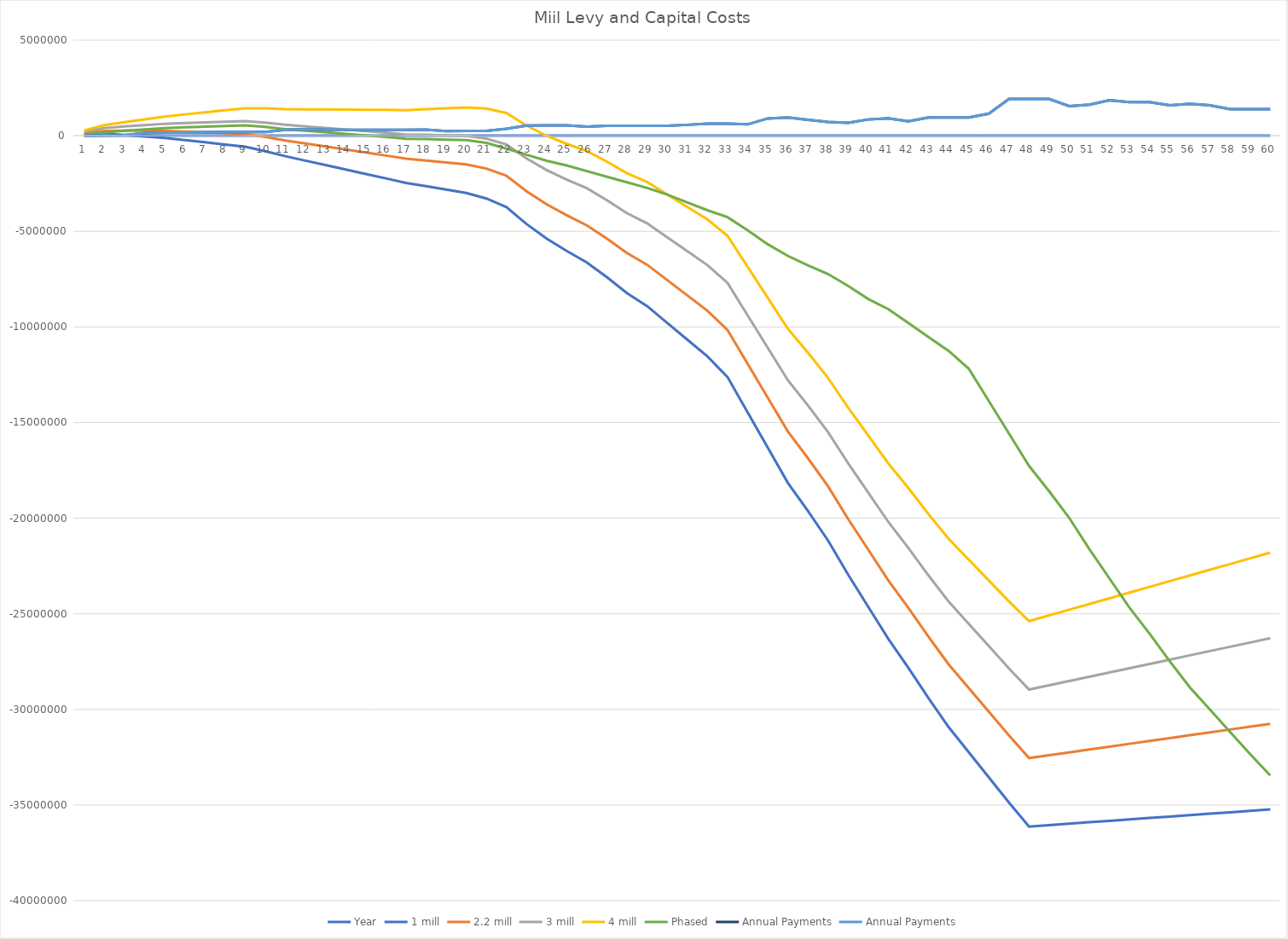
| Category | Year | 1 mill | 2.2 mill | 3 mill | 4 mill | Phased | Annual Payments |
|---|---|---|---|---|---|---|---|
| 0 | 1 | 54603.242 | 129206.484 | 203809.726 | 278412.968 | 54603.242 | 0 |
| 1 | 2 | 102446.484 | 251652.968 | 400859.452 | 550065.936 | 177049.726 | 20000 |
| 2 | 3 | 39904.726 | 263714.452 | 487524.178 | 711333.904 | 263714.452 | 26760 |
| 3 | 4 | -41224.032 | 257188.936 | 555601.904 | 854014.872 | 331792.178 | 137145 |
| 4 | 5 | -122352.79 | 250663.42 | 623679.63 | 996695.84 | 399869.904 | 155732 |
| 5 | 6 | -228481.548 | 219137.904 | 666757.356 | 1114376.808 | 442947.63 | 155732 |
| 6 | 7 | -345471.306 | 176751.388 | 698974.082 | 1221196.776 | 475164.356 | 180732 |
| 7 | 8 | -462461.064 | 134364.872 | 731190.808 | 1328016.744 | 507381.082 | 191593 |
| 8 | 9 | -579450.822 | 91978.356 | 763407.534 | 1434836.712 | 539597.808 | 191593 |
| 9 | 10 | -811096.58 | -65064.16 | 680968.26 | 1427000.68 | 457158.534 | 191593 |
| 10 | 11 | -1072742.338 | -252106.676 | 568528.986 | 1389164.648 | 344719.26 | 306249 |
| 11 | 12 | -1304388.096 | -409149.192 | 486089.712 | 1381328.616 | 262279.986 | 336249 |
| 12 | 13 | -1536033.854 | -566191.708 | 403650.438 | 1373492.584 | 179840.712 | 306249 |
| 13 | 14 | -1767679.612 | -723234.224 | 321211.164 | 1365656.552 | 97401.438 | 306249 |
| 14 | 15 | -1999325.37 | -880276.74 | 238771.89 | 1357820.52 | 14962.164 | 306249 |
| 15 | 16 | -2230971.128 | -1037319.256 | 156332.616 | 1349984.488 | -67477.11 | 306249 |
| 16 | 17 | -2470856.886 | -1202601.772 | 65653.342 | 1333908.456 | -158156.384 | 306249 |
| 17 | 18 | -2640739.644 | -1297881.288 | 44977.068 | 1387835.424 | -178832.658 | 314489 |
| 18 | 19 | -2817668.402 | -1400206.804 | 17254.794 | 1434716.392 | -206554.932 | 244486 |
| 19 | 20 | -2994597.16 | -1502532.32 | -10467.48 | 1481597.36 | -234277.206 | 251532 |
| 20 | 21 | -3282527.918 | -1715859.836 | -149191.754 | 1417476.328 | -373001.48 | 251532 |
| 21 | 22 | -3736458.676 | -2095187.352 | -453916.028 | 1187355.296 | -677725.754 | 362534 |
| 22 | 23 | -4619252.434 | -2903377.868 | -1187503.302 | 528371.264 | -993557.028 | 528534 |
| 23 | 24 | -5376044.192 | -3585566.384 | -1795088.576 | -4610.768 | -1309388.302 | 539641 |
| 24 | 25 | -6024478.95 | -4159397.9 | -2294316.85 | -429235.8 | -1555563.576 | 539641 |
| 25 | 26 | -6625945.708 | -4686261.416 | -2746577.124 | -806892.832 | -1849731.85 | 469985 |
| 26 | 27 | -7398287.466 | -5383999.932 | -3369712.398 | -1355424.864 | -2143900.124 | 517978 |
| 27 | 28 | -8230629.224 | -6141738.448 | -4052847.672 | -1963956.896 | -2438068.398 | 517978 |
| 28 | 29 | -8909977.982 | -6746483.964 | -4582989.946 | -2419495.928 | -2732236.672 | 517978 |
| 29 | 30 | -9787136.74 | -7549039.48 | -5310942.22 | -3072844.96 | -3076404.946 | 517978 |
| 30 | 31 | -10664295.498 | -8351594.996 | -6038894.494 | -3726193.992 | -3486228.22 | 567978 |
| 31 | 32 | -11541454.256 | -9154150.512 | -6766846.768 | -4379543.024 | -3896051.494 | 633633 |
| 32 | 33 | -12621007.014 | -10159100.028 | -7697193.042 | -5235286.056 | -4263273.768 | 633633 |
| 33 | 34 | -14464485.772 | -11927975.544 | -9391465.316 | -6854955.088 | -4941861.042 | 591032 |
| 34 | 35 | -16307964.53 | -13696851.06 | -11085737.59 | -8474624.12 | -5675448.316 | 902397 |
| 35 | 36 | -18151443.288 | -15465726.576 | -12780009.864 | -10094293.152 | -6283033.59 | 957397 |
| 36 | 37 | -19625143.046 | -16864823.092 | -14104503.138 | -11344183.184 | -6782261.864 | 831395 |
| 37 | 38 | -21168842.804 | -18333919.608 | -15498996.412 | -12664073.216 | -7234522.138 | 723038 |
| 38 | 39 | -22949410.562 | -20039884.124 | -17130357.686 | -14220831.248 | -7857657.412 | 676070 |
| 39 | 40 | -24632335.32 | -21648205.64 | -18664075.96 | -15679946.28 | -8540792.686 | 846945 |
| 40 | 41 | -26315260.078 | -23256527.156 | -20197794.234 | -17139061.312 | -9070934.96 | 906945 |
| 41 | 42 | -27827309.836 | -24693973.672 | -21560637.508 | -18427301.344 | -9798887.234 | 753952 |
| 42 | 43 | -29414359.594 | -26206420.188 | -22998480.782 | -19790541.376 | -10526839.508 | 951762 |
| 43 | 44 | -30926409.352 | -27643866.704 | -24361324.056 | -21078781.408 | -11254791.782 | 951762 |
| 44 | 45 | -32240649.11 | -28883503.22 | -25526357.33 | -22169211.44 | -12185138.056 | 951762 |
| 45 | 46 | -33554888.868 | -30123139.736 | -26691390.604 | -23259641.472 | -13879410.33 | 1154156 |
| 46 | 47 | -34869128.626 | -31362776.252 | -27856423.878 | -24350071.504 | -15573682.604 | 1918082 |
| 47 | 48 | -36125974.384 | -32545018.768 | -28964063.152 | -25383107.536 | -17267954.878 | 1918082 |
| 48 | 49 | -36051371.142 | -32395812.284 | -28740253.426 | -25084694.568 | -18592448.152 | 1918082 |
| 49 | 50 | -35976767.9 | -32246605.8 | -28516443.7 | -24786281.6 | -19986941.426 | 1548303 |
| 50 | 51 | -35902164.658 | -32097399.316 | -28292633.974 | -24487868.632 | -21618302.7 | 1618303 |
| 51 | 52 | -35827561.416 | -31948192.832 | -28068824.248 | -24189455.664 | -23152020.974 | 1855171 |
| 52 | 53 | -35752958.174 | -31798986.348 | -27845014.522 | -23891042.696 | -24685739.248 | 1757528 |
| 53 | 54 | -35678354.932 | -31649779.864 | -27621204.796 | -23592629.728 | -26048582.522 | 1757528 |
| 54 | 55 | -35603751.69 | -31500573.38 | -27397395.07 | -23294216.76 | -27486425.796 | 1586653 |
| 55 | 56 | -35529148.448 | -31351366.896 | -27173585.344 | -22995803.792 | -28849269.07 | 1661653 |
| 56 | 57 | -35454545.206 | -31202160.412 | -26949775.618 | -22697390.824 | -30014302.344 | 1586653 |
| 57 | 58 | -35379941.964 | -31052953.928 | -26725965.892 | -22398977.856 | -31179335.618 | 1388843 |
| 58 | 59 | -35305338.722 | -30903747.444 | -26502156.166 | -22100564.888 | -32344368.892 | 1388843 |
| 59 | 60 | -35230735.48 | -30754540.96 | -26278346.44 | -21802151.92 | -33452008.166 | 1388843 |